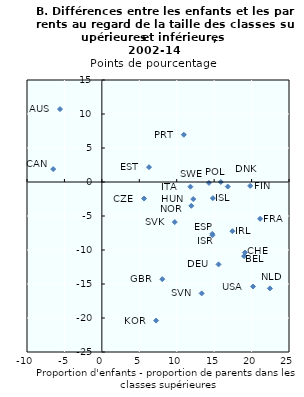
| Category | Lower classes |
|---|---|
| 20.2 | -15.37 |
| 19.0 | -10.9 |
| 19.12 | -10.37 |
| 5.64 | -2.43 |
| 15.59 | -12.12 |
| 16.82 | -0.67 |
| 6.3 | 2.18 |
| 14.75 | -7.63 |
| 19.81 | -0.57 |
| 21.14 | -5.41 |
| 8.07 | -14.29 |
| 12.21 | -2.51 |
| 17.44 | -7.23 |
| 14.78 | -7.83 |
| 14.83 | -2.38 |
| 11.83 | -0.69 |
| 22.45 | -15.64 |
| 11.95 | -3.5 |
| 15.89 | 0 |
| 10.95 | 6.95 |
| 14.3 | -0.13 |
| 13.33 | -16.38 |
| 9.74 | -5.89 |
| -5.59 | 10.72 |
| 7.25 | -20.38 |
| -6.5 | 1.9 |